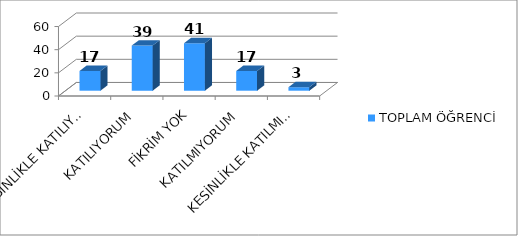
| Category | TOPLAM ÖĞRENCİ |
|---|---|
| KESİNLİKLE KATILIYORUM | 17 |
| KATILIYORUM | 39 |
| FİKRİM YOK | 41 |
| KATILMIYORUM | 17 |
| KESİNLİKLE KATILMIYORUM | 3 |